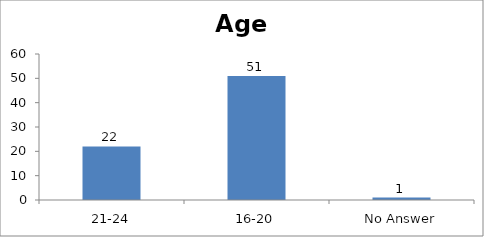
| Category | Age |
|---|---|
| 21-24 | 22 |
| 16-20 | 51 |
| No Answer | 1 |